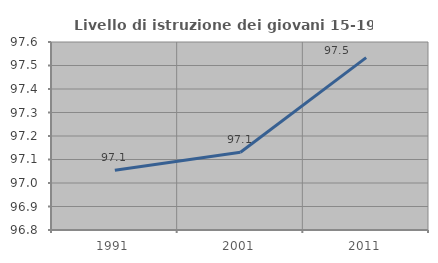
| Category | Livello di istruzione dei giovani 15-19 anni |
|---|---|
| 1991.0 | 97.054 |
| 2001.0 | 97.131 |
| 2011.0 | 97.534 |